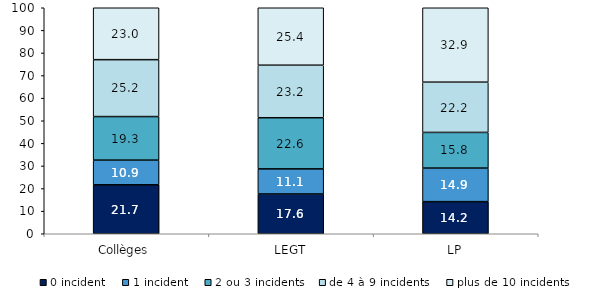
| Category | 0 incident | 1 incident | 2 ou 3 incidents | de 4 à 9 incidents  | plus de 10 incidents |
|---|---|---|---|---|---|
| Collèges | 21.66 | 10.93 | 19.26 | 25.18 | 22.97 |
| LEGT | 17.6 | 11.11 | 22.63 | 23.24 | 25.42 |
| LP | 14.21 | 14.85 | 15.78 | 22.23 | 32.92 |